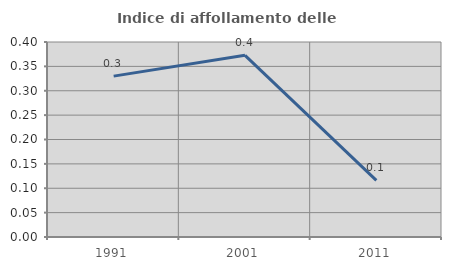
| Category | Indice di affollamento delle abitazioni  |
|---|---|
| 1991.0 | 0.33 |
| 2001.0 | 0.373 |
| 2011.0 | 0.116 |